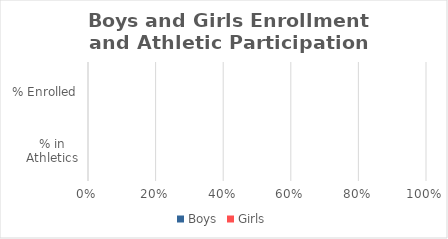
| Category | Boys | Girls |
|---|---|---|
| % in Athletics | 0 | 0 |
| % Enrolled | 0 | 0 |